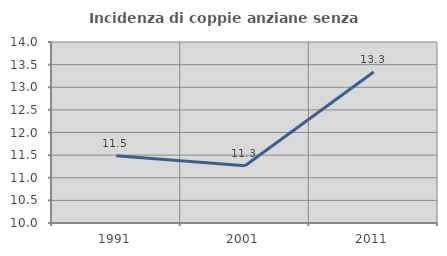
| Category | Incidenza di coppie anziane senza figli  |
|---|---|
| 1991.0 | 11.484 |
| 2001.0 | 11.264 |
| 2011.0 | 13.337 |